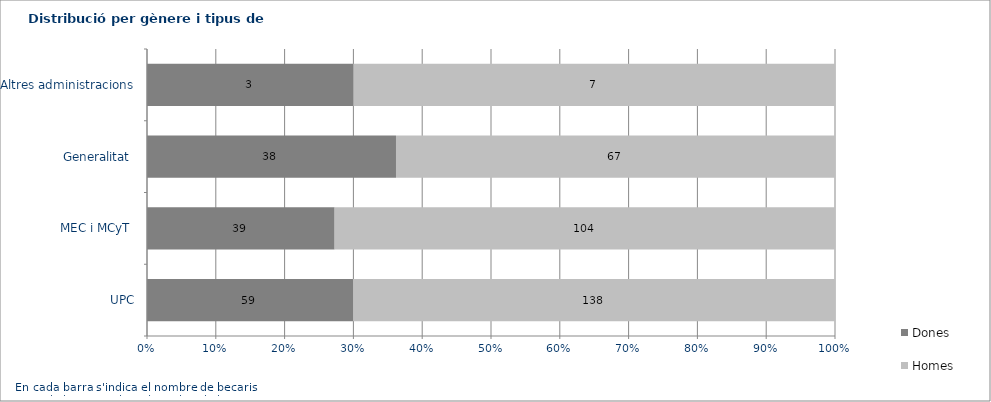
| Category | Dones | Homes |
|---|---|---|
| UPC | 59 | 138 |
| MEC i MCyT  | 39 | 104 |
| Generalitat  | 38 | 67 |
| Altres administracions | 3 | 7 |